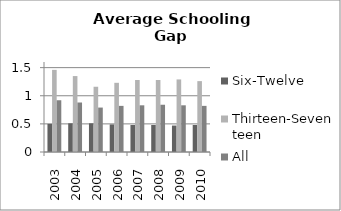
| Category | Six-Twelve | Thirteen-Seventeen | All |
|---|---|---|---|
| 2003.0 | 0.5 | 1.46 | 0.92 |
| 2004.0 | 0.51 | 1.35 | 0.88 |
| 2005.0 | 0.51 | 1.16 | 0.79 |
| 2006.0 | 0.49 | 1.23 | 0.82 |
| 2007.0 | 0.48 | 1.28 | 0.83 |
| 2008.0 | 0.48 | 1.28 | 0.84 |
| 2009.0 | 0.47 | 1.29 | 0.83 |
| 2010.0 | 0.48 | 1.26 | 0.82 |